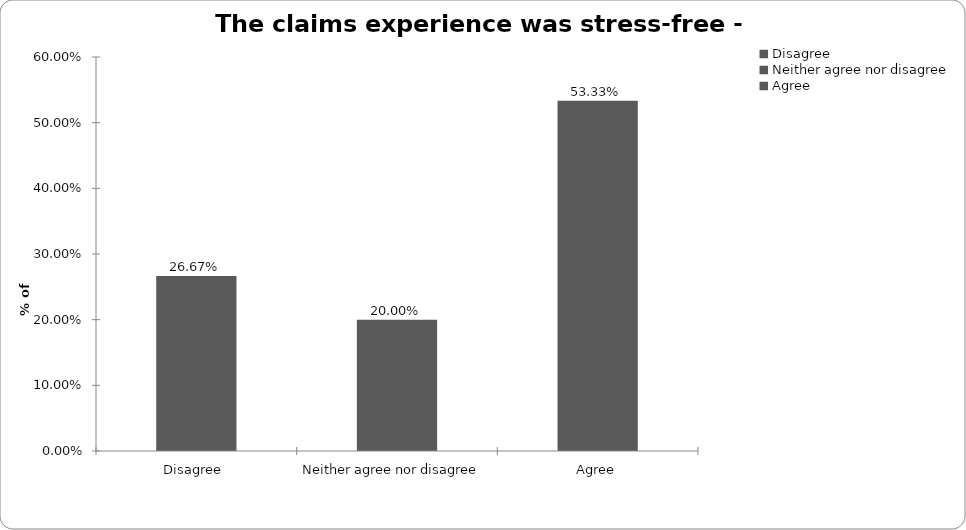
| Category | Travel |
|---|---|
| Disagree  | 0.267 |
| Neither agree nor disagree  | 0.2 |
| Agree | 0.533 |